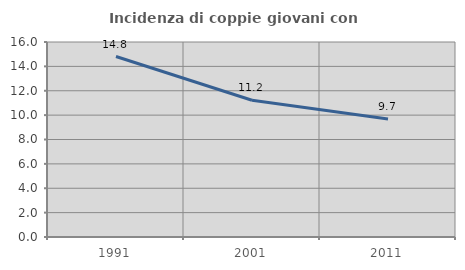
| Category | Incidenza di coppie giovani con figli |
|---|---|
| 1991.0 | 14.809 |
| 2001.0 | 11.221 |
| 2011.0 | 9.676 |